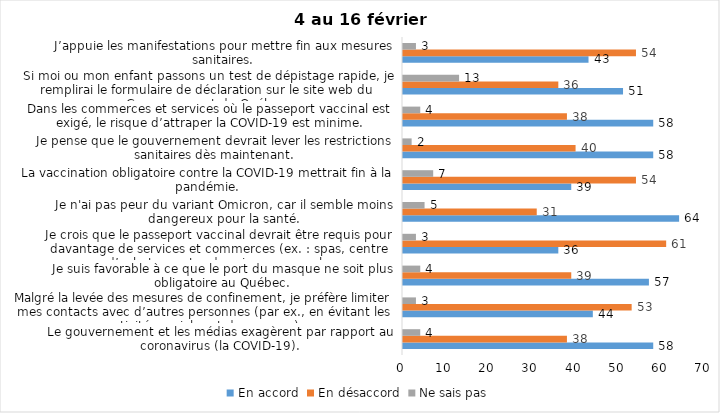
| Category | En accord | En désaccord | Ne sais pas |
|---|---|---|---|
| Le gouvernement et les médias exagèrent par rapport au coronavirus (la COVID-19). | 58 | 38 | 4 |
| Malgré la levée des mesures de confinement, je préfère limiter mes contacts avec d’autres personnes (par ex., en évitant les activités sociales et de groupes) | 44 | 53 | 3 |
| Je suis favorable à ce que le port du masque ne soit plus obligatoire au Québec. | 57 | 39 | 4 |
| Je crois que le passeport vaccinal devrait être requis pour davantage de services et commerces (ex. : spas, centre d’achats, centre de soins personnels. | 36 | 61 | 3 |
| Je n'ai pas peur du variant Omicron, car il semble moins dangereux pour la santé. | 64 | 31 | 5 |
| La vaccination obligatoire contre la COVID-19 mettrait fin à la pandémie. | 39 | 54 | 7 |
| Je pense que le gouvernement devrait lever les restrictions sanitaires dès maintenant. | 58 | 40 | 2 |
| Dans les commerces et services où le passeport vaccinal est exigé, le risque d’attraper la COVID-19 est minime. | 58 | 38 | 4 |
| Si moi ou mon enfant passons un test de dépistage rapide, je remplirai le formulaire de déclaration sur le site web du Gouvernement du Québec. | 51 | 36 | 13 |
| J’appuie les manifestations pour mettre fin aux mesures sanitaires. | 43 | 54 | 3 |